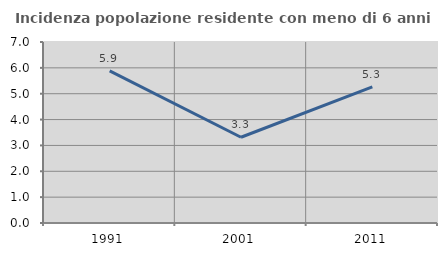
| Category | Incidenza popolazione residente con meno di 6 anni |
|---|---|
| 1991.0 | 5.882 |
| 2001.0 | 3.316 |
| 2011.0 | 5.263 |